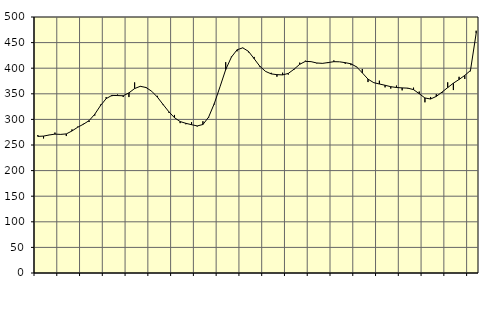
| Category | Piggar | Series 1 |
|---|---|---|
| nan | 269.5 | 266.78 |
| 1.0 | 262.8 | 267.42 |
| 1.0 | 269.8 | 269.55 |
| 1.0 | 274.3 | 271.25 |
| nan | 270.4 | 270.71 |
| 2.0 | 267.5 | 271.68 |
| 2.0 | 280.4 | 277.41 |
| 2.0 | 285.9 | 284.68 |
| nan | 291.4 | 290.55 |
| 3.0 | 294.9 | 297.56 |
| 3.0 | 307.5 | 310.14 |
| 3.0 | 328.8 | 326.82 |
| nan | 343.5 | 340.56 |
| 4.0 | 345.3 | 346.85 |
| 4.0 | 348.6 | 346.57 |
| 4.0 | 343.7 | 346.14 |
| nan | 343.6 | 351.82 |
| 5.0 | 372.2 | 360.26 |
| 5.0 | 364.1 | 364.64 |
| 5.0 | 361.4 | 362.33 |
| nan | 354.9 | 354.96 |
| 6.0 | 346 | 343.56 |
| 6.0 | 328 | 329.16 |
| 6.0 | 313.3 | 315.14 |
| nan | 308.7 | 303.35 |
| 7.0 | 292.7 | 295.8 |
| 7.0 | 290.5 | 292.33 |
| 7.0 | 294.7 | 289.65 |
| nan | 286.2 | 287.25 |
| 8.0 | 296.4 | 290.03 |
| 8.0 | 303.2 | 304.44 |
| 8.0 | 329.2 | 330.92 |
| nan | 363.7 | 363.66 |
| 9.0 | 411.8 | 397.23 |
| 9.0 | 422.6 | 421.59 |
| 9.0 | 433 | 435.95 |
| nan | 439.4 | 439.77 |
| 10.0 | 431 | 432.9 |
| 10.0 | 422 | 418.53 |
| 10.0 | 402.2 | 403.74 |
| nan | 393.5 | 393.75 |
| 11.0 | 391 | 388.88 |
| 11.0 | 383.4 | 387.4 |
| 11.0 | 391.2 | 386.91 |
| nan | 387.6 | 389.8 |
| 12.0 | 396.9 | 397.97 |
| 12.0 | 410.8 | 407.58 |
| 12.0 | 414.6 | 413.34 |
| nan | 412.9 | 412.8 |
| 13.0 | 409.5 | 410.16 |
| 13.0 | 409.1 | 409.45 |
| 13.0 | 410 | 411.03 |
| nan | 415.2 | 412.73 |
| 14.0 | 412.5 | 412.5 |
| 14.0 | 408.6 | 410.8 |
| 14.0 | 405.9 | 408.59 |
| nan | 403.1 | 402.56 |
| 15.0 | 398.5 | 390.89 |
| 15.0 | 372.9 | 378.66 |
| 15.0 | 371.2 | 371.77 |
| nan | 375.6 | 369.16 |
| 16.0 | 362.6 | 366.66 |
| 16.0 | 360.2 | 363.9 |
| 16.0 | 366.1 | 362.29 |
| nan | 356.7 | 361.53 |
| 17.0 | 360.2 | 361.04 |
| 17.0 | 362 | 358.18 |
| 17.0 | 354.4 | 350.2 |
| nan | 333.4 | 341.87 |
| 18.0 | 343.8 | 339.8 |
| 18.0 | 349.3 | 344.97 |
| 18.0 | 351.5 | 353.3 |
| nan | 372.4 | 362.12 |
| 19.0 | 357.3 | 370.76 |
| 19.0 | 383.2 | 377.97 |
| 19.0 | 379 | 385.94 |
| nan | 394 | 395.49 |
| 20.0 | 473.2 | 468.06 |